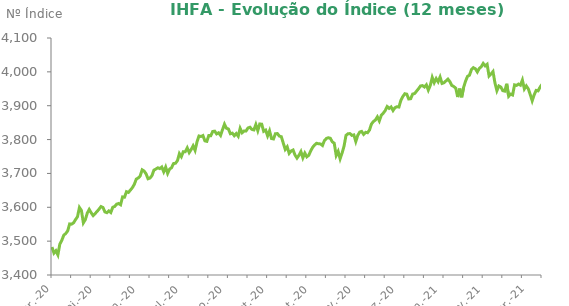
| Category | Series 0 |
|---|---|
| 2020-03-31 | 3482.69 |
| 2020-04-01 | 3464.66 |
| 2020-04-02 | 3471.63 |
| 2020-04-03 | 3459.45 |
| 2020-04-06 | 3491.37 |
| 2020-04-07 | 3502.44 |
| 2020-04-08 | 3517.42 |
| 2020-04-09 | 3522.58 |
| 2020-04-13 | 3530.2 |
| 2020-04-14 | 3550.84 |
| 2020-04-15 | 3550.16 |
| 2020-04-16 | 3554.02 |
| 2020-04-17 | 3563.62 |
| 2020-04-20 | 3572.06 |
| 2020-04-22 | 3599.5 |
| 2020-04-23 | 3590.7 |
| 2020-04-24 | 3553.96 |
| 2020-04-27 | 3563.46 |
| 2020-04-28 | 3582.75 |
| 2020-04-29 | 3593.61 |
| 2020-04-30 | 3583.65 |
| 2020-05-04 | 3575.37 |
| 2020-05-05 | 3581.44 |
| 2020-05-06 | 3587.63 |
| 2020-05-07 | 3594.54 |
| 2020-05-08 | 3602.11 |
| 2020-05-11 | 3599.47 |
| 2020-05-12 | 3586.3 |
| 2020-05-13 | 3584 |
| 2020-05-14 | 3589.31 |
| 2020-05-15 | 3584.44 |
| 2020-05-18 | 3599.99 |
| 2020-05-19 | 3602.49 |
| 2020-05-20 | 3609.25 |
| 2020-05-21 | 3611.21 |
| 2020-05-22 | 3607.41 |
| 2020-05-25 | 3630.63 |
| 2020-05-26 | 3629.82 |
| 2020-05-27 | 3646.06 |
| 2020-05-28 | 3643.92 |
| 2020-05-29 | 3650.81 |
| 2020-06-01 | 3657.86 |
| 2020-06-02 | 3667.86 |
| 2020-06-03 | 3683.17 |
| 2020-06-04 | 3686.68 |
| 2020-06-05 | 3692.61 |
| 2020-06-08 | 3710.65 |
| 2020-06-09 | 3707.06 |
| 2020-06-10 | 3698.77 |
| 2020-06-12 | 3684.29 |
| 2020-06-15 | 3686.41 |
| 2020-06-16 | 3693.57 |
| 2020-06-17 | 3709.78 |
| 2020-06-18 | 3712.96 |
| 2020-06-19 | 3716.59 |
| 2020-06-22 | 3714.3 |
| 2020-06-23 | 3718.92 |
| 2020-06-24 | 3704.84 |
| 2020-06-25 | 3718.72 |
| 2020-06-26 | 3700.07 |
| 2020-06-29 | 3712.85 |
| 2020-06-30 | 3716.91 |
| 2020-07-01 | 3729.12 |
| 2020-07-02 | 3730 |
| 2020-07-03 | 3737.58 |
| 2020-07-06 | 3758.49 |
| 2020-07-07 | 3749.55 |
| 2020-07-08 | 3764.34 |
| 2020-07-09 | 3764.21 |
| 2020-07-10 | 3775.51 |
| 2020-07-13 | 3761.57 |
| 2020-07-14 | 3770.34 |
| 2020-07-15 | 3781.38 |
| 2020-07-16 | 3768.15 |
| 2020-07-17 | 3793.61 |
| 2020-07-20 | 3810.59 |
| 2020-07-21 | 3809.03 |
| 2020-07-22 | 3811.91 |
| 2020-07-23 | 3796.29 |
| 2020-07-24 | 3794.76 |
| 2020-07-27 | 3812 |
| 2020-07-28 | 3811.34 |
| 2020-07-29 | 3823.88 |
| 2020-07-30 | 3824.8 |
| 2020-07-31 | 3816.68 |
| 2020-08-03 | 3820.06 |
| 2020-08-04 | 3812.26 |
| 2020-08-05 | 3829.22 |
| 2020-08-06 | 3845.41 |
| 2020-08-07 | 3833.55 |
| 2020-08-10 | 3831.33 |
| 2020-08-11 | 3817.21 |
| 2020-08-12 | 3818.92 |
| 2020-08-13 | 3811.41 |
| 2020-08-14 | 3817.89 |
| 2020-08-17 | 3809.92 |
| 2020-08-18 | 3833.05 |
| 2020-08-19 | 3820.12 |
| 2020-08-20 | 3825.3 |
| 2020-08-21 | 3825.31 |
| 2020-08-24 | 3834.3 |
| 2020-08-25 | 3836.4 |
| 2020-08-26 | 3830.04 |
| 2020-08-27 | 3828.46 |
| 2020-08-28 | 3844.48 |
| 2020-08-31 | 3826.39 |
| 2020-09-01 | 3846.14 |
| 2020-09-02 | 3845.4 |
| 2020-09-03 | 3824.38 |
| 2020-09-04 | 3827.94 |
| 2020-09-08 | 3810.96 |
| 2020-09-09 | 3825.78 |
| 2020-09-10 | 3803.03 |
| 2020-09-11 | 3801.82 |
| 2020-09-14 | 3817.47 |
| 2020-09-15 | 3817.64 |
| 2020-09-16 | 3810.27 |
| 2020-09-17 | 3808.54 |
| 2020-09-18 | 3789.61 |
| 2020-09-21 | 3770.85 |
| 2020-09-22 | 3778.58 |
| 2020-09-23 | 3759.35 |
| 2020-09-24 | 3766.39 |
| 2020-09-25 | 3769.15 |
| 2020-09-28 | 3754.15 |
| 2020-09-29 | 3745.23 |
| 2020-09-30 | 3753.64 |
| 2020-10-01 | 3764.5 |
| 2020-10-02 | 3745.97 |
| 2020-10-05 | 3760.02 |
| 2020-10-06 | 3748.99 |
| 2020-10-07 | 3753.5 |
| 2020-10-08 | 3766.65 |
| 2020-10-09 | 3777.19 |
| 2020-10-13 | 3784.1 |
| 2020-10-14 | 3789.08 |
| 2020-10-15 | 3787.5 |
| 2020-10-16 | 3787.18 |
| 2020-10-19 | 3782.57 |
| 2020-10-20 | 3797.23 |
| 2020-10-21 | 3803.26 |
| 2020-10-22 | 3805.46 |
| 2020-10-23 | 3803.83 |
| 2020-10-26 | 3793.41 |
| 2020-10-27 | 3789.23 |
| 2020-10-28 | 3753.16 |
| 2020-10-29 | 3765 |
| 2020-10-30 | 3743.2 |
| 2020-11-03 | 3760.2 |
| 2020-11-04 | 3780.52 |
| 2020-11-05 | 3812.25 |
| 2020-11-06 | 3817.11 |
| 2020-11-09 | 3817.77 |
| 2020-11-10 | 3812.47 |
| 2020-11-11 | 3813.86 |
| 2020-11-12 | 3794.28 |
| 2020-11-13 | 3812.36 |
| 2020-11-16 | 3822.16 |
| 2020-11-17 | 3824.03 |
| 2020-11-18 | 3815.25 |
| 2020-11-19 | 3821.41 |
| 2020-11-20 | 3820.26 |
| 2020-11-23 | 3828.39 |
| 2020-11-24 | 3845.88 |
| 2020-11-25 | 3853.47 |
| 2020-11-26 | 3857.65 |
| 2020-11-27 | 3867.12 |
| 2020-11-30 | 3855.05 |
| 2020-12-01 | 3871.75 |
| 2020-12-02 | 3877.88 |
| 2020-12-03 | 3885.5 |
| 2020-12-04 | 3897.62 |
| 2020-12-07 | 3892.04 |
| 2020-12-08 | 3896.42 |
| 2020-12-09 | 3885.78 |
| 2020-12-10 | 3894.3 |
| 2020-12-11 | 3897.04 |
| 2020-12-14 | 3896.11 |
| 2020-12-15 | 3915.91 |
| 2020-12-16 | 3927.07 |
| 2020-12-17 | 3935.34 |
| 2020-12-18 | 3934.05 |
| 2020-12-21 | 3919.86 |
| 2020-12-22 | 3920.69 |
| 2020-12-23 | 3934.3 |
| 2020-12-24 | 3936.01 |
| 2020-12-28 | 3942.95 |
| 2020-12-29 | 3950.19 |
| 2020-12-30 | 3958.34 |
| 2020-12-31 | 3959.42 |
| 2021-01-04 | 3955.28 |
| 2021-01-05 | 3961.68 |
| 2021-01-06 | 3946.08 |
| 2021-01-07 | 3959.91 |
| 2021-01-08 | 3983.61 |
| 2021-01-11 | 3968.18 |
| 2021-01-12 | 3980.22 |
| 2021-01-13 | 3970.68 |
| 2021-01-14 | 3984.72 |
| 2021-01-15 | 3965.79 |
| 2021-01-18 | 3967.89 |
| 2021-01-19 | 3973.23 |
| 2021-01-20 | 3978.48 |
| 2021-01-21 | 3971.03 |
| 2021-01-22 | 3959.66 |
| 2021-01-25 | 3956.69 |
| 2021-01-26 | 3951.66 |
| 2021-01-27 | 3925.52 |
| 2021-01-28 | 3950.5 |
| 2021-01-29 | 3924.94 |
| 2021-02-01 | 3953.82 |
| 2021-02-02 | 3972.6 |
| 2021-02-03 | 3986.69 |
| 2021-02-04 | 3990.2 |
| 2021-02-05 | 4006.56 |
| 2021-02-08 | 4012.28 |
| 2021-02-09 | 4009.25 |
| 2021-02-10 | 3999.73 |
| 2021-02-11 | 4010.06 |
| 2021-02-12 | 4015.12 |
| 2021-02-17 | 4024.82 |
| 2021-02-18 | 4017.66 |
| 2021-02-19 | 4022.34 |
| 2021-02-22 | 3987.76 |
| 2021-02-23 | 3993.76 |
| 2021-02-24 | 4000.86 |
| 2021-02-25 | 3967.23 |
| 2021-02-26 | 3944.47 |
| 2021-03-01 | 3958.31 |
| 2021-03-02 | 3955.07 |
| 2021-03-03 | 3944.44 |
| 2021-03-04 | 3943.1 |
| 2021-03-05 | 3964.81 |
| 2021-03-08 | 3928.07 |
| 2021-03-09 | 3934.21 |
| 2021-03-10 | 3931.67 |
| 2021-03-11 | 3961.52 |
| 2021-03-12 | 3959.95 |
| 2021-03-15 | 3963.95 |
| 2021-03-16 | 3960.68 |
| 2021-03-17 | 3975.84 |
| 2021-03-18 | 3949.49 |
| 2021-03-19 | 3958.61 |
| 2021-03-22 | 3949.93 |
| 2021-03-23 | 3933.15 |
| 2021-03-24 | 3914.5 |
| 2021-03-25 | 3931.89 |
| 2021-03-26 | 3945.28 |
| 2021-03-29 | 3943.87 |
| 2021-03-30 | 3954.78 |
| 2021-03-31 | 3963.24 |